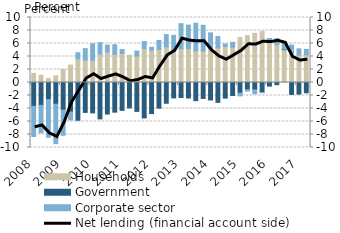
| Category | Households | Government | Corporate sector |
|---|---|---|---|
| 2008.0 | 1.412 | -3.665 | -4.638 |
| 2008.0 | 1.112 | -3.515 | -4.211 |
| 2008.0 | 0.606 | -2.637 | -5.794 |
| 2008.0 | 1.037 | -3.34 | -6.075 |
| 2009.0 | 2.006 | -4.242 | -3.88 |
| 2009.0 | 2.679 | -4.556 | -1.202 |
| 2009.0 | 3.64 | -5.811 | 0.933 |
| 2009.0 | 3.446 | -4.597 | 1.766 |
| 2010.0 | 3.416 | -4.672 | 2.532 |
| 2010.0 | 4.377 | -5.599 | 1.755 |
| 2010.0 | 4.683 | -4.851 | 1.077 |
| 2010.0 | 4.353 | -4.565 | 1.456 |
| 2011.0 | 4.461 | -4.292 | 0.611 |
| 2011.0 | 4.184 | -3.975 | -0.029 |
| 2011.0 | 4.079 | -4.443 | 0.752 |
| 2011.0 | 5.243 | -5.451 | 1.051 |
| 2012.0 | 4.958 | -4.785 | 0.459 |
| 2012.0 | 5.11 | -3.954 | 1.357 |
| 2012.0 | 5.492 | -3.192 | 1.873 |
| 2012.0 | 5.051 | -2.366 | 2.202 |
| 2013.0 | 5.181 | -2.306 | 3.869 |
| 2013.0 | 5.209 | -2.388 | 3.621 |
| 2013.0 | 4.874 | -2.792 | 4.244 |
| 2013.0 | 4.841 | -2.456 | 3.961 |
| 2014.0 | 5.226 | -2.685 | 2.413 |
| 2014.0 | 5.345 | -3.05 | 1.721 |
| 2014.0 | 5.551 | -2.403 | 0.365 |
| 2014.0 | 5.438 | -1.995 | 0.74 |
| 2015.0 | 6.916 | -1.631 | -0.428 |
| 2015.0 | 7.201 | -1.101 | -0.219 |
| 2015.0 | 7.559 | -1.127 | -0.594 |
| 2015.0 | 7.836 | -1.549 | -0.001 |
| 2016.0 | 6.195 | -0.557 | 0.579 |
| 2016.0 | 5.823 | -0.337 | 0.927 |
| 2016.0 | 5.056 | 0.083 | 0.96 |
| 2016.0 | 4.591 | -1.828 | 1.171 |
| 2017.0 | 4.222 | -1.792 | 0.95 |
| nan | 4.254 | -1.587 | 0.843 |